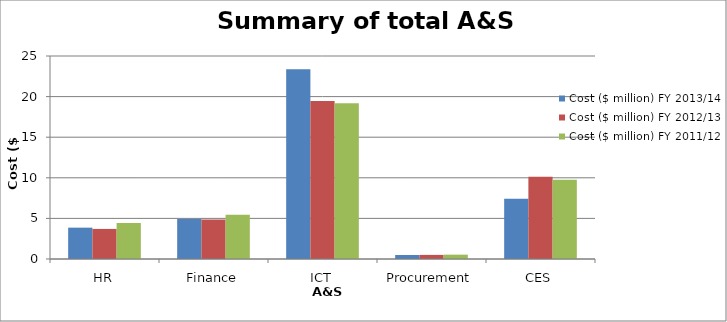
| Category | Cost ($ million) FY 2013/14 | Cost ($ million) FY 2012/13 | Cost ($ million) FY 2011/12 |
|---|---|---|---|
| HR | 3.861 | 3.704 | 4.441 |
| Finance | 4.938 | 4.877 | 5.453 |
| ICT | 23.379 | 19.454 | 19.179 |
| Procurement | 0.493 | 0.506 | 0.534 |
| CES | 7.415 | 10.117 | 9.771 |